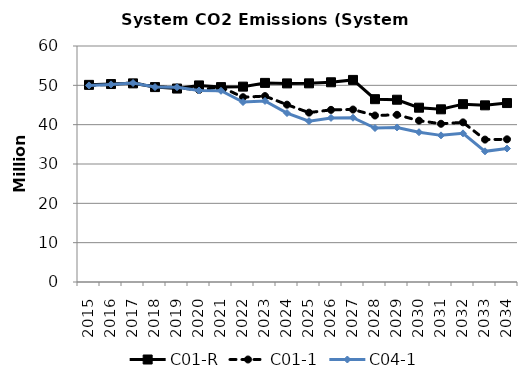
| Category | C01-R | C01-1 | C04-1 |
|---|---|---|---|
| 2015.0 | 50.118 | 49.98 | 49.98 |
| 2016.0 | 50.329 | 50.239 | 50.239 |
| 2017.0 | 50.499 | 50.623 | 50.593 |
| 2018.0 | 49.555 | 49.637 | 49.56 |
| 2019.0 | 49.181 | 49.422 | 49.52 |
| 2020.0 | 49.976 | 48.827 | 48.68 |
| 2021.0 | 49.548 | 49.578 | 48.615 |
| 2022.0 | 49.671 | 46.971 | 45.75 |
| 2023.0 | 50.618 | 47.262 | 46.031 |
| 2024.0 | 50.491 | 45.086 | 42.949 |
| 2025.0 | 50.508 | 43.063 | 40.898 |
| 2026.0 | 50.777 | 43.764 | 41.72 |
| 2027.0 | 51.38 | 43.847 | 41.761 |
| 2028.0 | 46.481 | 42.329 | 39.147 |
| 2029.0 | 46.342 | 42.511 | 39.293 |
| 2030.0 | 44.317 | 41.021 | 38.08 |
| 2031.0 | 43.901 | 40.228 | 37.281 |
| 2032.0 | 45.215 | 40.585 | 37.79 |
| 2033.0 | 44.915 | 36.207 | 33.218 |
| 2034.0 | 45.496 | 36.272 | 33.931 |